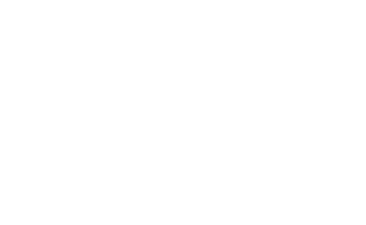
| Category | Series 0 |
|---|---|
| BUDGET | 0 |
| ACTUAL | 0 |